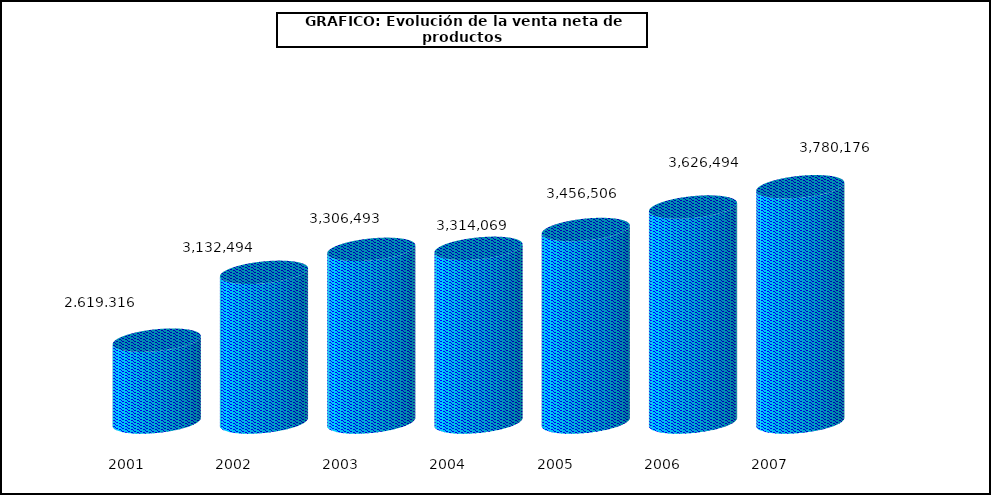
| Category | Series 0 |
|---|---|
| 2001.0 | 2619316 |
| 2002.0 | 3132494 |
| 2003.0 | 3306493 |
| 2004.0 | 3314069 |
| 2005.0 | 3456506 |
| 2006.0 | 3626494 |
| 2007.0 | 3780176 |